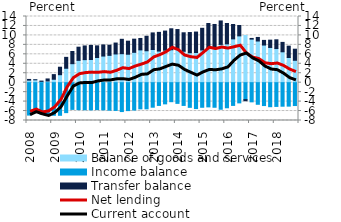
| Category | Balance of goods and services | Income balance | Transfer balance |
|---|---|---|---|
| 2008.0 | 0.542 | -6.855 | 0.144 |
| 2008.0 | 0.607 | -6.318 | 0.016 |
| 2008.0 | 0.276 | -6.627 | 0.057 |
| 2008.0 | 0.356 | -6.874 | 0.434 |
| 2009.0 | 0.725 | -6.896 | 0.982 |
| 2009.0 | 1.689 | -6.9 | 1.582 |
| 2009.0 | 3.052 | -6.333 | 2.306 |
| 2009.0 | 4.018 | -5.649 | 2.584 |
| 2010.0 | 4.723 | -5.709 | 2.785 |
| 2010.0 | 4.875 | -5.734 | 2.897 |
| 2010.0 | 4.906 | -5.753 | 2.976 |
| 2010.0 | 5.323 | -5.696 | 2.468 |
| 2011.0 | 5.632 | -5.751 | 2.353 |
| 2011.0 | 5.782 | -5.822 | 2.145 |
| 2011.0 | 6.075 | -5.873 | 2.309 |
| 2011.0 | 6.133 | -6.11 | 3.044 |
| 2012.0 | 6.016 | -5.905 | 2.764 |
| 2012.0 | 6.423 | -5.787 | 2.783 |
| 2012.0 | 6.938 | -5.537 | 2.417 |
| 2012.0 | 6.753 | -5.533 | 3.069 |
| 2013.0 | 7.019 | -5.186 | 3.511 |
| 2013.0 | 6.687 | -4.813 | 3.957 |
| 2013.0 | 6.877 | -4.481 | 4.041 |
| 2013.0 | 6.964 | -4.021 | 4.439 |
| 2014.0 | 7.045 | -4.377 | 4.196 |
| 2014.0 | 6.644 | -4.812 | 3.912 |
| 2014.0 | 6.341 | -5.217 | 4.266 |
| 2014.0 | 6.378 | -5.478 | 4.33 |
| 2015.0 | 6.926 | -5.202 | 4.579 |
| 2015.0 | 7.419 | -5.119 | 5.096 |
| 2015.0 | 7.611 | -5.199 | 4.703 |
| 2015.0 | 8.097 | -5.618 | 4.963 |
| 2016.0 | 8.211 | -5.308 | 4.308 |
| 2016.0 | 9.27 | -4.808 | 3.036 |
| 2016.0 | 9.902 | -4.273 | 2.193 |
| 2016.0 | 9.98 | -3.582 | -0.238 |
| 2017.0 | 9.216 | -4.054 | 0.144 |
| 2017.0 | 8.816 | -4.57 | 0.754 |
| 2017.0 | 7.963 | -4.839 | 0.982 |
| 2017.0 | 7.449 | -5.084 | 1.549 |
| 2018.0 | 7.218 | -5.021 | 1.853 |
| 2018.0 | 6.535 | -4.979 | 1.986 |
| 2018.0 | 5.325 | -4.959 | 2.403 |
| 2018.0 | 4.734 | -4.835 | 2.347 |